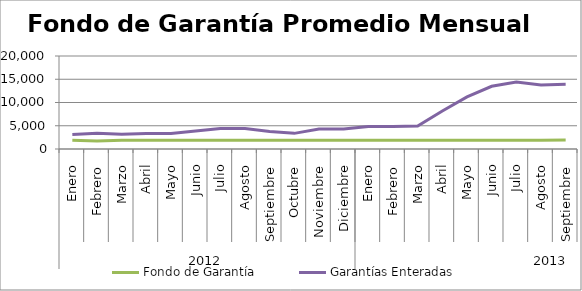
| Category | Fondo de Garantía | Garantías Enteradas |
|---|---|---|
| 0 | 1896.798 | 3141.641 |
| 1 | 1714.423 | 3362.648 |
| 2 | 1900.513 | 3154.118 |
| 3 | 1900.513 | 3348.058 |
| 4 | 1898.685 | 3308.859 |
| 5 | 1900.513 | 3850.375 |
| 6 | 1900.513 | 4400.539 |
| 7 | 1895.388 | 4383.327 |
| 8 | 1900.513 | 3757.632 |
| 9 | 1900.513 | 3362.932 |
| 10 | 1900.311 | 4285.609 |
| 11 | 1890.98 | 4296.87 |
| 12 | 1898.667 | 4842.786 |
| 13 | 1900.512 | 4845.136 |
| 14 | 1900.513 | 4938.365 |
| 15 | 1900.513 | 8179.666 |
| 16 | 1900.513 | 11202.213 |
| 17 | 1900.513 | 13493.433 |
| 18 | 1900.513 | 14387.844 |
| 19 | 1900.496 | 13769.803 |
| 20 | 1951.853 | 13899.147 |